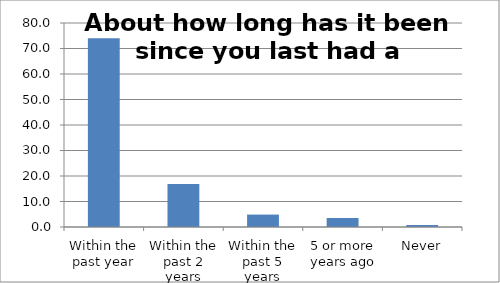
| Category | Series 0 |
|---|---|
| Within the past year | 74.007 |
| Within the past 2 years | 16.825 |
| Within the past 5 years | 4.871 |
| 5 or more years ago | 3.482 |
| Never | 0.816 |